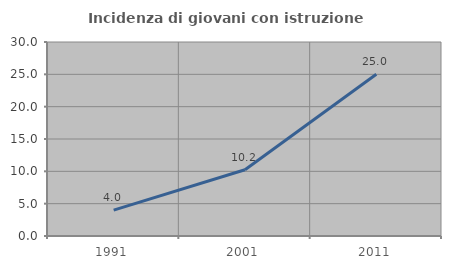
| Category | Incidenza di giovani con istruzione universitaria |
|---|---|
| 1991.0 | 4 |
| 2001.0 | 10.236 |
| 2011.0 | 25 |